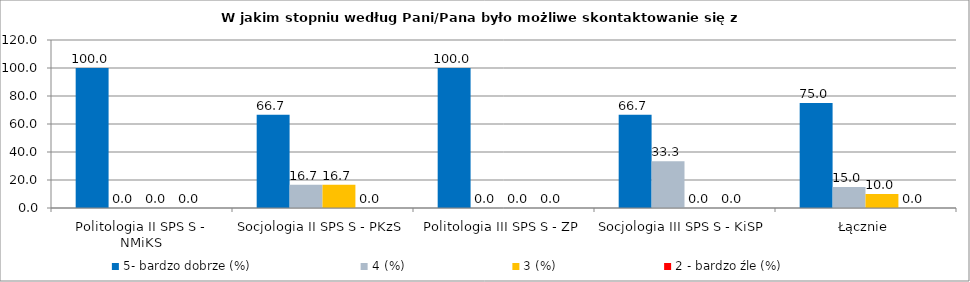
| Category | 5- bardzo dobrze (%) | 4 (%) | 3 (%) | 2 - bardzo źle (%) |
|---|---|---|---|---|
| Politologia II SPS S - NMiKS | 100 | 0 | 0 | 0 |
| Socjologia II SPS S - PKzS | 66.667 | 16.667 | 16.667 | 0 |
| Politologia III SPS S - ZP | 100 | 0 | 0 | 0 |
| Socjologia III SPS S - KiSP | 66.667 | 33.333 | 0 | 0 |
| Łącznie | 75 | 15 | 10 | 0 |